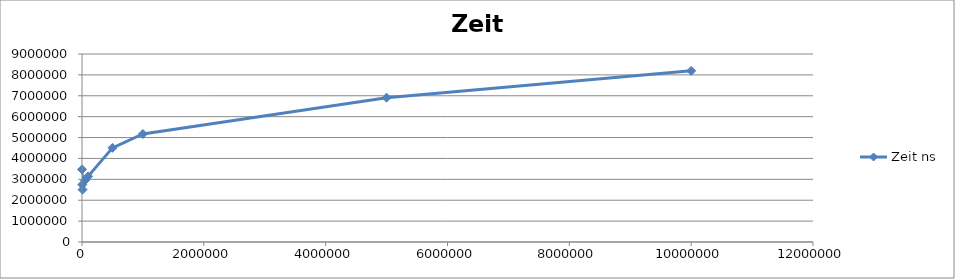
| Category | Zeit ns |
|---|---|
| 1000.0 | 3475878 |
| 5000.0 | 2746834 |
| 10000.0 | 2506386 |
| 50000.0 | 2949896 |
| 100000.0 | 3142694 |
| 500000.0 | 4506948 |
| 1000000.0 | 5171114 |
| 5000000.0 | 6909970 |
| 10000000.0 | 8192485 |